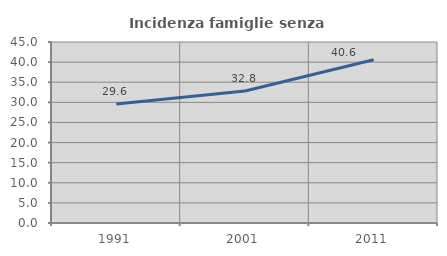
| Category | Incidenza famiglie senza nuclei |
|---|---|
| 1991.0 | 29.6 |
| 2001.0 | 32.818 |
| 2011.0 | 40.573 |